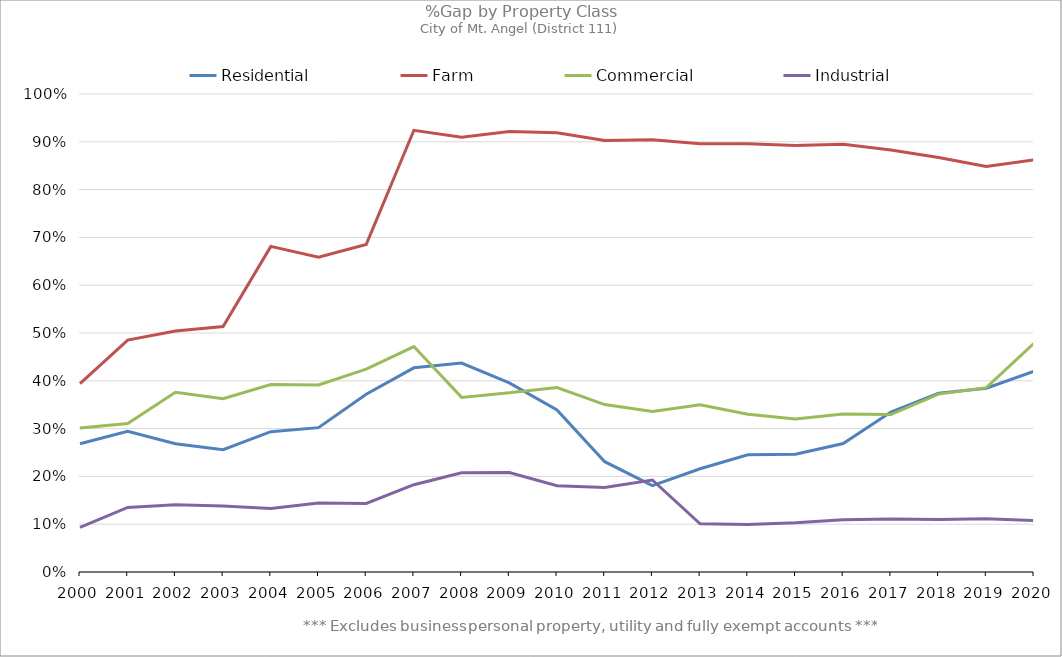
| Category | Residential | Farm | Commercial | Industrial |
|---|---|---|---|---|
| 2000.0 | 0.268 | 0.394 | 0.301 | 0.094 |
| 2001.0 | 0.294 | 0.485 | 0.311 | 0.135 |
| 2002.0 | 0.268 | 0.504 | 0.376 | 0.141 |
| 2003.0 | 0.256 | 0.514 | 0.363 | 0.138 |
| 2004.0 | 0.294 | 0.681 | 0.392 | 0.133 |
| 2005.0 | 0.302 | 0.659 | 0.391 | 0.144 |
| 2006.0 | 0.372 | 0.685 | 0.424 | 0.143 |
| 2007.0 | 0.427 | 0.924 | 0.472 | 0.183 |
| 2008.0 | 0.437 | 0.91 | 0.365 | 0.208 |
| 2009.0 | 0.396 | 0.922 | 0.375 | 0.208 |
| 2010.0 | 0.339 | 0.919 | 0.386 | 0.181 |
| 2011.0 | 0.231 | 0.903 | 0.35 | 0.177 |
| 2012.0 | 0.181 | 0.904 | 0.336 | 0.192 |
| 2013.0 | 0.216 | 0.896 | 0.35 | 0.101 |
| 2014.0 | 0.245 | 0.896 | 0.33 | 0.099 |
| 2015.0 | 0.246 | 0.892 | 0.32 | 0.103 |
| 2016.0 | 0.269 | 0.895 | 0.331 | 0.109 |
| 2017.0 | 0.335 | 0.883 | 0.329 | 0.111 |
| 2018.0 | 0.374 | 0.867 | 0.372 | 0.11 |
| 2019.0 | 0.384 | 0.849 | 0.386 | 0.111 |
| 2020.0 | 0.42 | 0.862 | 0.479 | 0.107 |